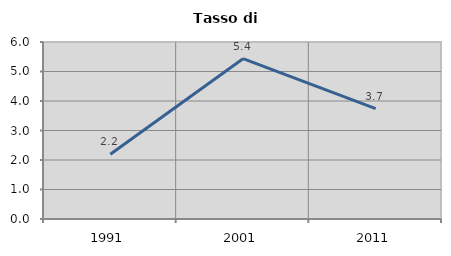
| Category | Tasso di disoccupazione   |
|---|---|
| 1991.0 | 2.198 |
| 2001.0 | 5.435 |
| 2011.0 | 3.738 |